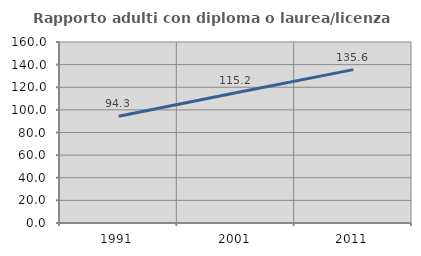
| Category | Rapporto adulti con diploma o laurea/licenza media  |
|---|---|
| 1991.0 | 94.286 |
| 2001.0 | 115.217 |
| 2011.0 | 135.556 |